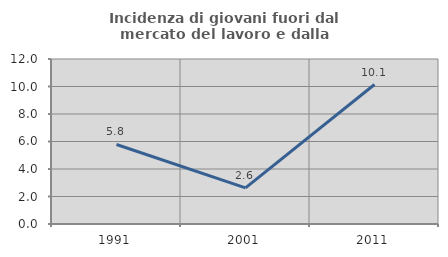
| Category | Incidenza di giovani fuori dal mercato del lavoro e dalla formazione  |
|---|---|
| 1991.0 | 5.785 |
| 2001.0 | 2.632 |
| 2011.0 | 10.145 |